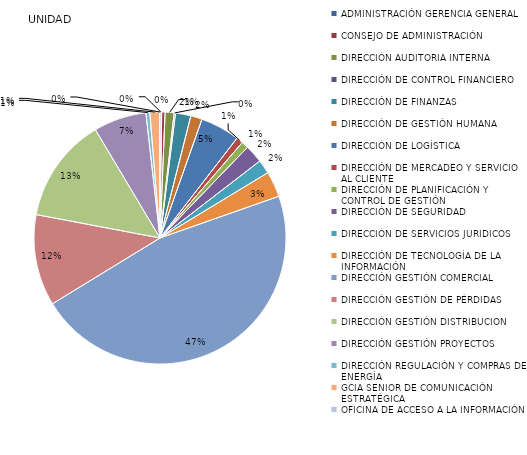
| Category | Series 0 |
|---|---|
| ADMINISTRACIÓN GERENCIA GENERAL | 6 |
| CONSEJO DE ADMINISTRACIÓN | 12 |
| DIRECCIÓN AUDITORIA INTERNA | 32 |
| DIRECCIÓN DE CONTROL FINANCIERO | 5 |
| DIRECCIÓN DE FINANZAS | 55 |
| DIRECCIÓN DE GESTIÓN HUMANA | 41 |
| DIRECCIÓN DE LOGÍSTICA | 141 |
| DIRECCIÓN DE MERCADEO Y SERVICIO AL CLIENTE | 24 |
| DIRECCIÓN DE PLANIFICACIÓN Y CONTROL DE GESTIÓN | 25 |
| DIRECCIÓN DE SEGURIDAD | 65 |
| DIRECCIÓN DE SERVICIOS JURIDICOS | 50 |
| DIRECCIÓN DE TECNOLOGÍA DE LA INFORMACIÓN | 92 |
| DIRECCIÓN GESTIÓN COMERCIAL | 1302 |
| DIRECCIÓN GESTIÓN DE PÉRDIDAS | 327 |
| DIRECCIÓN GESTIÓN DISTRIBUCION | 376 |
| DIRECCIÓN GESTIÓN PROYECTOS | 189 |
| DIRECCIÓN REGULACIÓN Y COMPRAS DE ENERGÍA | 14 |
| GCIA SENIOR DE COMUNICACIÓN ESTRATÉGICA | 35 |
| OFICINA DE ACCESO A LA INFORMACIÓN | 1 |